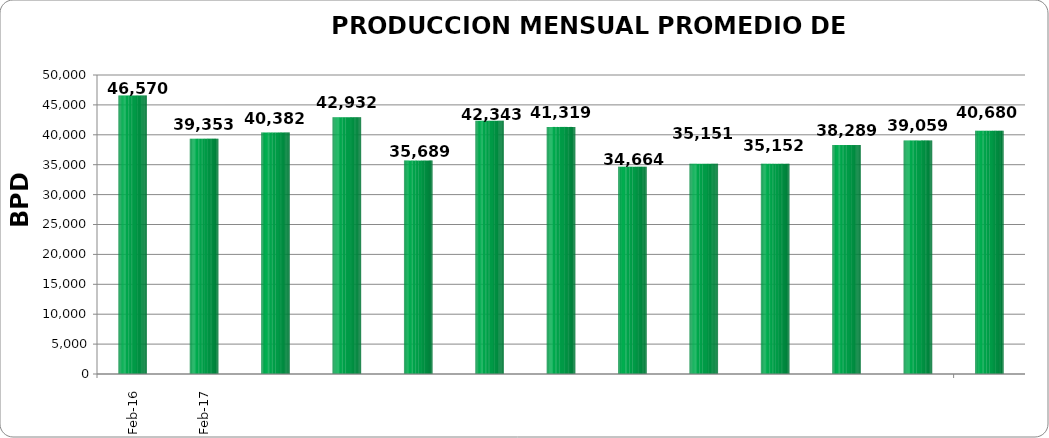
| Category | TOTAL PAIS 
(BPD) #¡REF! #¡REF! #¡REF! #¡REF! #¡REF! #¡REF! #¡REF! #¡REF! #¡REF! #¡REF! #¡REF! #¡REF! #¡REF! #¡REF! #¡REF! #¡REF! #¡REF! #¡REF! #¡REF! #¡REF! #¡REF! #¡REF! #¡REF! #¡REF! #¡REF! #¡REF! #¡REF! #¡REF! #¡REF! #¡REF! #¡REF! #¡REF! #¡REF! #¡REF! |
|---|---|
| 2016-02-01 | 46569.862 |
| 2016-03-01 | 39352.774 |
| 2016-04-01 | 40382 |
| 2016-05-01 | 42932.129 |
| 2016-06-01 | 35689.484 |
| 2016-07-01 | 42342.774 |
| 2016-08-01 | 41318.968 |
| 2016-09-01 | 34664.167 |
| 2016-10-01 | 35151.065 |
| 2016-11-01 | 35152.433 |
| 2016-12-01 | 38288.645 |
| 2017-01-01 | 39058.903 |
| 2017-02-01 | 40679.714 |